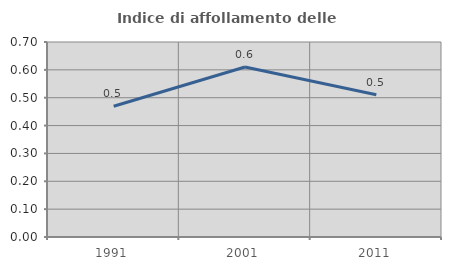
| Category | Indice di affollamento delle abitazioni  |
|---|---|
| 1991.0 | 0.469 |
| 2001.0 | 0.61 |
| 2011.0 | 0.511 |